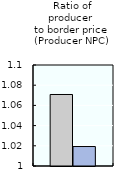
| Category | 2000-02 | 2016-18 |
|---|---|---|
| Ratio of producer 
to border price 
(Producer NPC) | 1.071 | 1.019 |